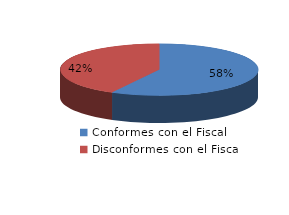
| Category | Series 0 |
|---|---|
| 0 | 776 |
| 1 | 566 |